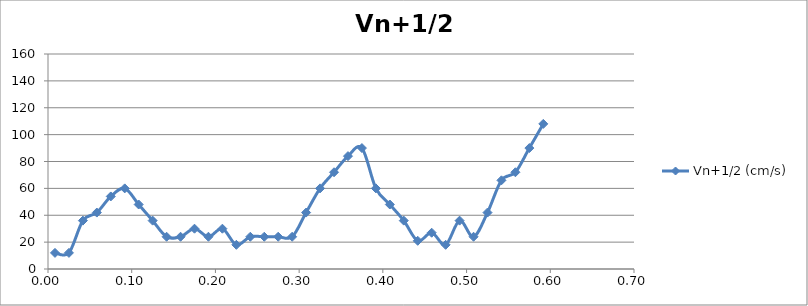
| Category | Vn+1/2 (cm/s) |
|---|---|
| 0.00833333333333333 | 12 |
| 0.025 | 12 |
| 0.0416666666666667 | 36 |
| 0.0583333333333333 | 42 |
| 0.075 | 54 |
| 0.0916666666666666 | 60 |
| 0.108333333333333 | 48 |
| 0.125 | 36 |
| 0.141666666666667 | 24 |
| 0.158333333333333 | 24 |
| 0.175 | 30 |
| 0.191666666666667 | 24 |
| 0.208333333333333 | 30 |
| 0.225 | 18 |
| 0.241666666666667 | 24 |
| 0.258333333333333 | 24 |
| 0.275 | 24 |
| 0.291666666666667 | 24 |
| 0.308333333333333 | 42 |
| 0.325 | 60 |
| 0.341666666666667 | 72 |
| 0.358333333333333 | 84 |
| 0.375 | 90 |
| 0.391666666666667 | 60 |
| 0.408333333333333 | 48 |
| 0.425 | 36 |
| 0.441666666666667 | 21 |
| 0.458333333333333 | 27 |
| 0.475 | 18 |
| 0.491666666666667 | 36 |
| 0.508333333333333 | 24 |
| 0.525 | 42 |
| 0.541666666666667 | 66 |
| 0.558333333333333 | 72 |
| 0.575 | 90 |
| 0.591666666666667 | 108 |